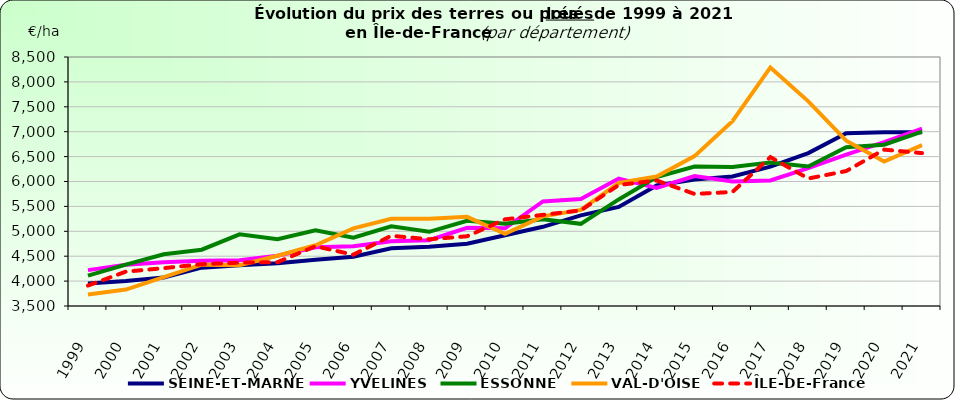
| Category | SEINE-ET-MARNE | YVELINES | ESSONNE | VAL-D'OISE | ÎLE-DE-France |
|---|---|---|---|---|---|
| 1999 | 3950 | 4220 | 4110 | 3730 | 3910 |
| 2000 | 4000 | 4330 | 4330 | 3830 | 4190 |
| 2001 | 4070 | 4380 | 4540 | 4080 | 4260 |
| 2002 | 4270 | 4410 | 4630 | 4330 | 4340 |
| 2003 | 4320 | 4420 | 4940 | 4320 | 4370 |
| 2004 | 4360 | 4510 | 4840 | 4510 | 4380 |
| 2005 | 4430 | 4680 | 5020 | 4720 | 4700 |
| 2006 | 4490 | 4700 | 4870 | 5060 | 4530 |
| 2007 | 4660 | 4800 | 5100 | 5250 | 4910 |
| 2008 | 4690 | 4820 | 4990 | 5250 | 4840 |
| 2009 | 4750 | 5070 | 5210 | 5290 | 4900 |
| 2010 | 4920 | 5060 | 5150 | 4950 | 5240 |
| 2011 | 5090 | 5600 | 5240 | 5300 | 5330 |
| 2012 | 5320 | 5650 | 5150 | 5430 | 5420 |
| 2013 | 5490 | 6060 | 5640 | 5970 | 5930 |
| 2014 | 5920 | 5870 | 6090 | 6100 | 6020 |
| 2015 | 6040 | 6110 | 6300 | 6510 | 5750 |
| 2016 | 6100 | 6000 | 6290 | 7210 | 5790 |
| 2017 | 6300 | 6020 | 6380 | 8290 | 6490 |
| 2018 | 6570 | 6270 | 6300 | 7610 | 6060 |
| 2019 | 6970 | 6540 | 6690 | 6820 | 6210 |
| 2020 | 6990 | 6790 | 6740 | 6400 | 6640 |
| 2021 | 6990 | 7060 | 7000 | 6730 | 6570 |